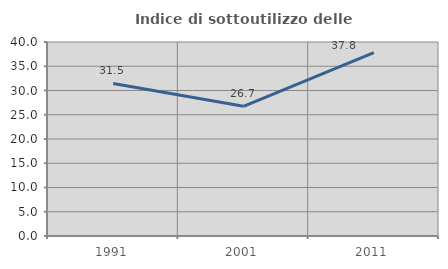
| Category | Indice di sottoutilizzo delle abitazioni  |
|---|---|
| 1991.0 | 31.461 |
| 2001.0 | 26.749 |
| 2011.0 | 37.815 |